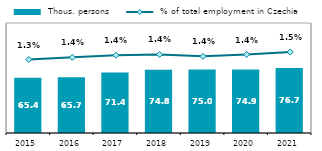
| Category |  Thous. persons |
|---|---|
| 2015.0 | 65.385 |
| 2016.0 | 65.745 |
| 2017.0 | 71.399 |
| 2018.0 | 74.838 |
| 2019.0 | 74.998 |
| 2020.0 | 74.912 |
| 2021.0 | 76.682 |